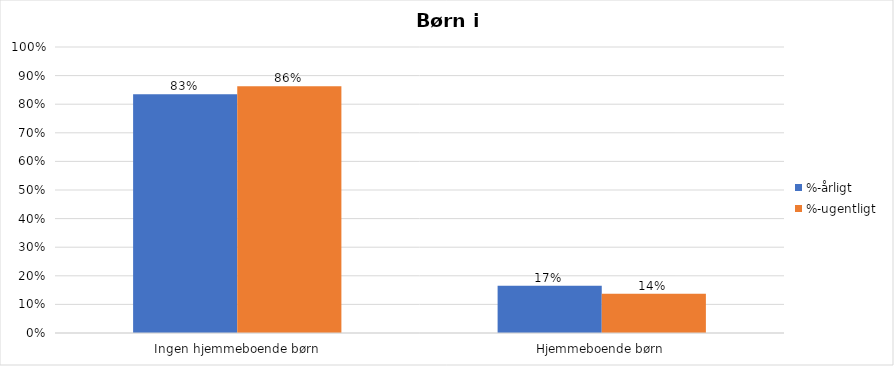
| Category | %-årligt | %-ugentligt |
|---|---|---|
| Ingen hjemmeboende børn | 0.835 | 0.863 |
| Hjemmeboende børn | 0.165 | 0.137 |